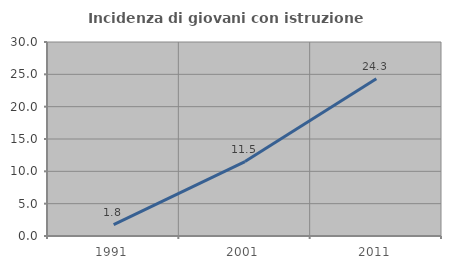
| Category | Incidenza di giovani con istruzione universitaria |
|---|---|
| 1991.0 | 1.763 |
| 2001.0 | 11.507 |
| 2011.0 | 24.324 |